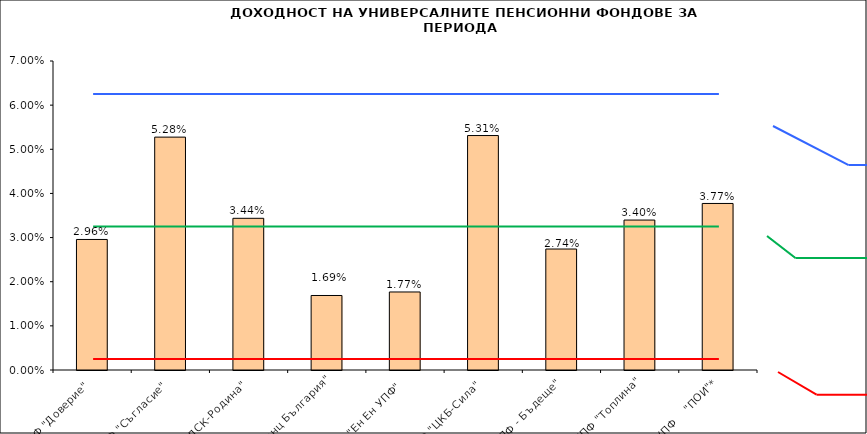
| Category | Series 0 |
|---|---|
| УПФ "Доверие"  | 0.03 |
| УПФ "Съгласие"  | 0.053 |
| УПФ "ДСК-Родина"  | 0.034 |
| "ЗУПФ Алианц България" | 0.017 |
| "Eн Ен УПФ"  | 0.018 |
| УПФ "ЦКБ-Сила"  | 0.053 |
| "УПФ - Бъдеще" | 0.027 |
| УПФ "Топлина" | 0.034 |
| УПФ    "ПОИ"* | 0.038 |